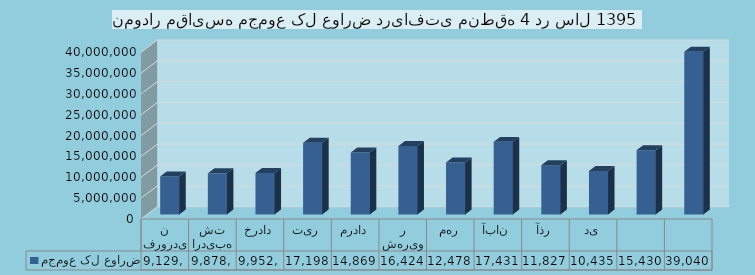
| Category | مجموع کل عوارض |
|---|---|
| فروردین | 9129906 |
| اردیبهشت | 9878092 |
| خرداد | 9952554 |
| تیر | 17198753 |
| مرداد | 14869798 |
| شهریور | 16424953 |
| مهر | 12478719 |
| آبان | 17431891 |
| آذر | 11827883 |
| دی | 10435852 |